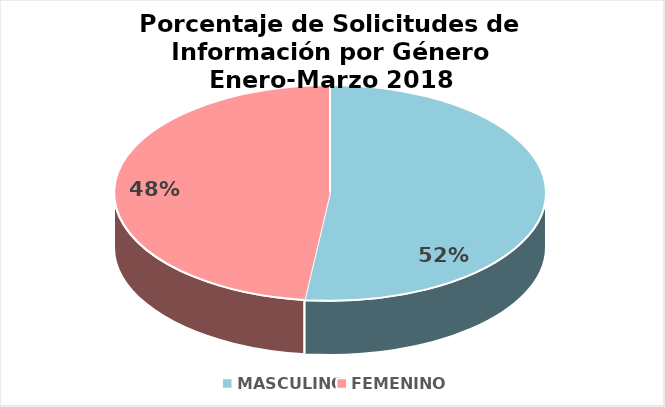
| Category | Series 0 |
|---|---|
| MASCULINO | 0.519 |
| FEMENINO | 0.481 |